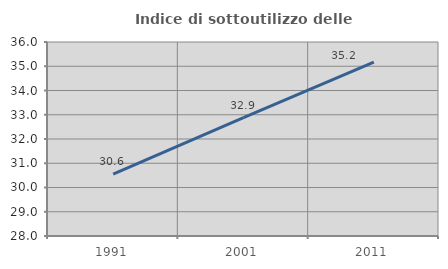
| Category | Indice di sottoutilizzo delle abitazioni  |
|---|---|
| 1991.0 | 30.551 |
| 2001.0 | 32.884 |
| 2011.0 | 35.173 |